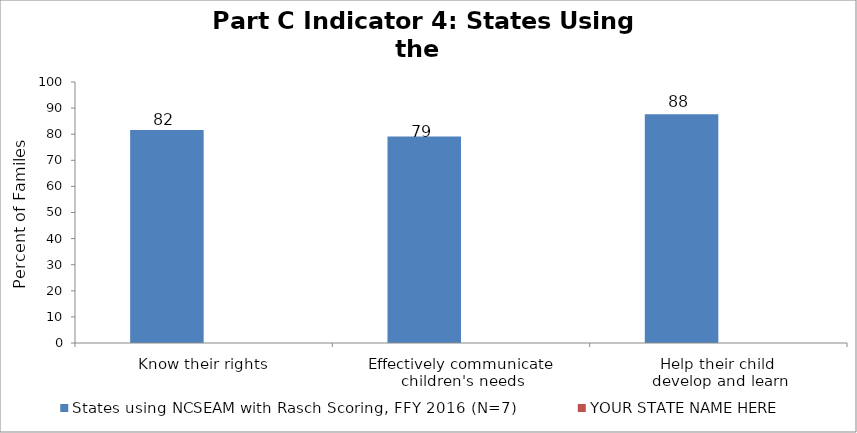
| Category | States using NCSEAM with Rasch Scoring, FFY 2016 (N=7) | YOUR STATE NAME HERE |
|---|---|---|
| Know their rights | 81.621 |  |
| Effectively communicate 
children's needs | 79.112 |  |
| Help their child 
develop and learn | 87.639 |  |